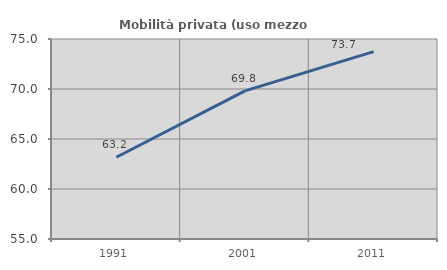
| Category | Mobilità privata (uso mezzo privato) |
|---|---|
| 1991.0 | 63.176 |
| 2001.0 | 69.807 |
| 2011.0 | 73.735 |